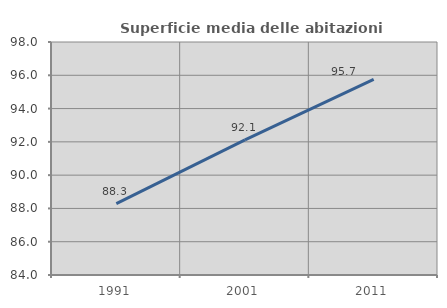
| Category | Superficie media delle abitazioni occupate |
|---|---|
| 1991.0 | 88.293 |
| 2001.0 | 92.114 |
| 2011.0 | 95.75 |